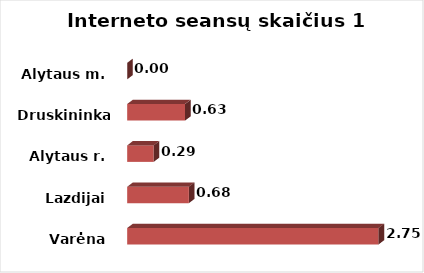
| Category | Series 0 |
|---|---|
| Varėna | 2.755 |
| Lazdijai | 0.676 |
| Alytaus r. | 0.291 |
| Druskininkai  | 0.634 |
| Alytaus m. | 0 |